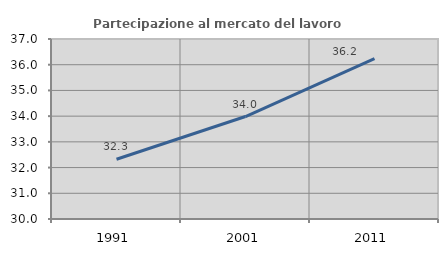
| Category | Partecipazione al mercato del lavoro  femminile |
|---|---|
| 1991.0 | 32.325 |
| 2001.0 | 33.985 |
| 2011.0 | 36.234 |